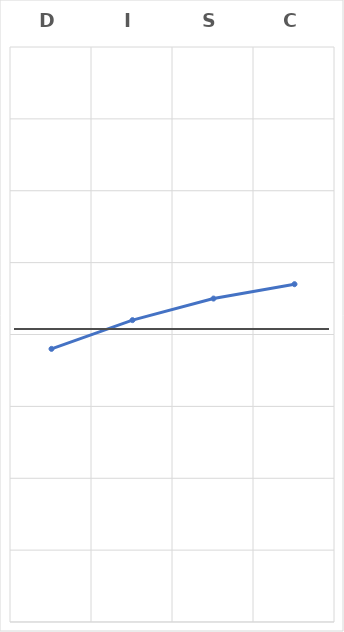
| Category | Series 0 |
|---|---|
| D | 3.8 |
| I | 4.2 |
| S | 4.5 |
| C | 4.7 |